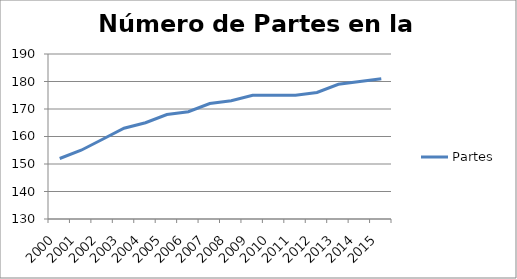
| Category | Partes  |
|---|---|
| 2000.0 | 152 |
| 2001.0 | 155 |
| 2002.0 | 159 |
| 2003.0 | 163 |
| 2004.0 | 165 |
| 2005.0 | 168 |
| 2006.0 | 169 |
| 2007.0 | 172 |
| 2008.0 | 173 |
| 2009.0 | 175 |
| 2010.0 | 175 |
| 2011.0 | 175 |
| 2012.0 | 176 |
| 2013.0 | 179 |
| 2014.0 | 180 |
| 2015.0 | 181 |